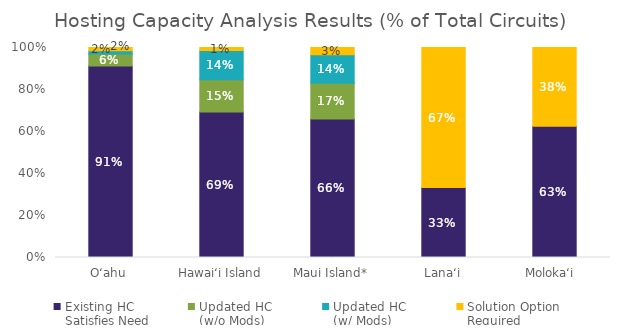
| Category | Existing HC 
Satisfies Need | Updated HC 
(w/o Mods) 
Satisfies Need | Updated HC 
(w/ Mods) 
Satisfies Need | Solution Option 
Required |
|---|---|---|---|---|
| O‘ahu | 0.911 | 0.057 | 0.016 | 0.016 |
| Hawai‘i Island | 0.693 | 0.153 | 0.139 | 0.015 |
| Maui Island* | 0.659 | 0.17 | 0.136 | 0.034 |
| Lana‘i | 0.333 | 0 | 0 | 0.667 |
| Moloka‘i  | 0.625 | 0 | 0 | 0.375 |